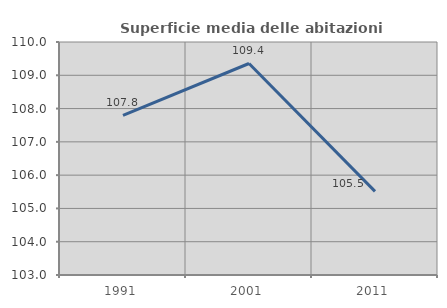
| Category | Superficie media delle abitazioni occupate |
|---|---|
| 1991.0 | 107.797 |
| 2001.0 | 109.354 |
| 2011.0 | 105.512 |